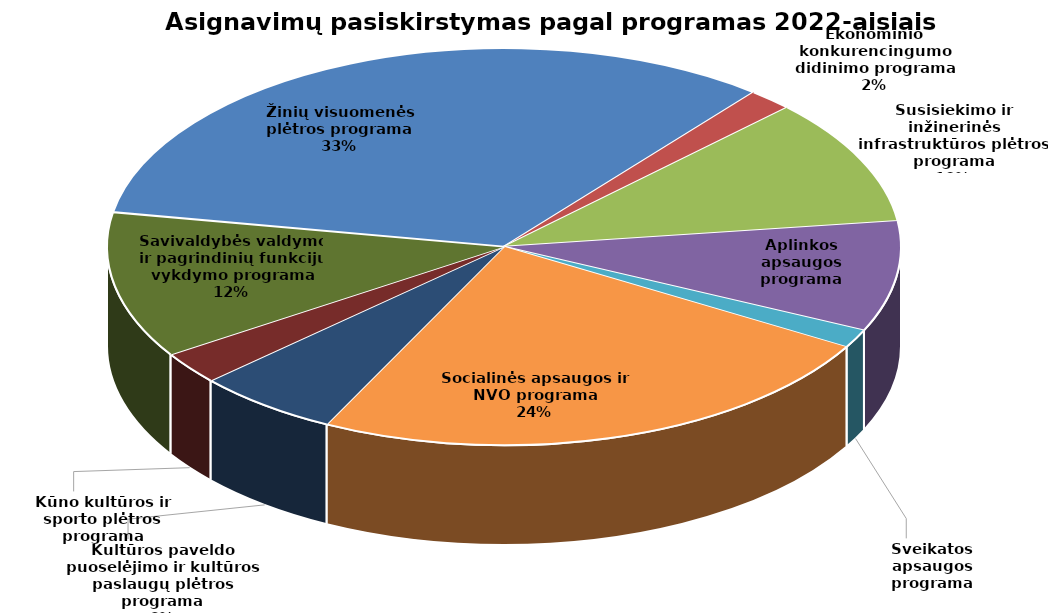
| Category | Series 0 |
|---|---|
| Žinių visuomenės plėtros programa | 40970.3 |
| Ekonominio konkurencingumo didinimo programa | 2252.7 |
| Susisiekimo ir inžinerinės infrastruktūros plėtros programa | 12760.732 |
| Aplinkos apsaugos programa | 11150.9 |
| Sveikatos apsaugos programa | 1869.7 |
| Socialinės apsaugos ir NVO programa | 29658 |
| Kultūros paveldo puoselėjimo ir kultūros paslaugų plėtros programa | 7267.5 |
| Kūno kultūros ir sporto plėtros programa | 3262.6 |
| Savivaldybės valdymo ir pagrindinių funkcijų vykdymo programa | 14774.9 |